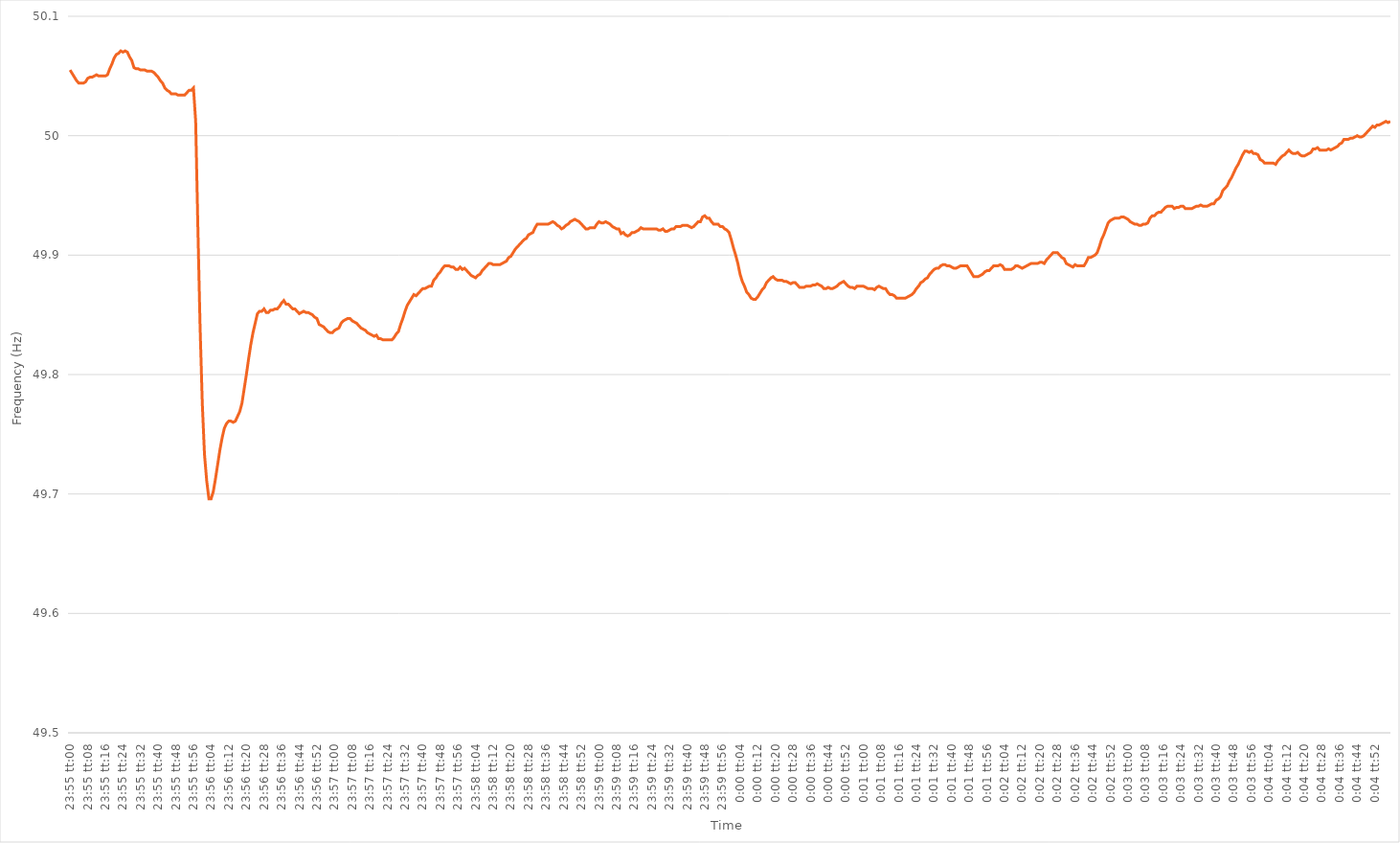
| Category | Series 0 |
|---|---|
| 0.9965277777777778 | 50.055 |
| 0.9965393518518518 | 50.052 |
| 0.9965509259259259 | 50.049 |
| 0.9965625 | 50.046 |
| 0.9965740740740742 | 50.044 |
| 0.9965856481481481 | 50.044 |
| 0.9965972222222222 | 50.044 |
| 0.9966087962962963 | 50.045 |
| 0.9966203703703704 | 50.048 |
| 0.9966319444444444 | 50.049 |
| 0.9966435185185185 | 50.049 |
| 0.9966550925925927 | 50.05 |
| 0.9966666666666667 | 50.051 |
| 0.9966782407407407 | 50.05 |
| 0.9966898148148148 | 50.05 |
| 0.9967013888888889 | 50.05 |
| 0.9967129629629629 | 50.05 |
| 0.996724537037037 | 50.051 |
| 0.9967361111111112 | 50.056 |
| 0.9967476851851852 | 50.06 |
| 0.9967592592592592 | 50.065 |
| 0.9967708333333333 | 50.068 |
| 0.9967824074074074 | 50.069 |
| 0.9967939814814816 | 50.071 |
| 0.9968055555555555 | 50.07 |
| 0.9968171296296297 | 50.071 |
| 0.9968287037037037 | 50.07 |
| 0.9968402777777778 | 50.066 |
| 0.9968518518518518 | 50.063 |
| 0.9968634259259259 | 50.057 |
| 0.9968750000000001 | 50.056 |
| 0.9968865740740741 | 50.056 |
| 0.9968981481481481 | 50.055 |
| 0.9969097222222222 | 50.055 |
| 0.9969212962962963 | 50.055 |
| 0.9969328703703703 | 50.054 |
| 0.9969444444444444 | 50.054 |
| 0.9969560185185186 | 50.054 |
| 0.9969675925925926 | 50.053 |
| 0.9969791666666666 | 50.051 |
| 0.9969907407407407 | 50.049 |
| 0.9970023148148148 | 50.046 |
| 0.997013888888889 | 50.044 |
| 0.9970254629629629 | 50.04 |
| 0.997037037037037 | 50.038 |
| 0.9970486111111111 | 50.037 |
| 0.9970601851851852 | 50.035 |
| 0.9970717592592592 | 50.035 |
| 0.9970833333333333 | 50.035 |
| 0.9970949074074075 | 50.034 |
| 0.9971064814814815 | 50.034 |
| 0.9971180555555555 | 50.034 |
| 0.9971296296296296 | 50.034 |
| 0.9971412037037037 | 50.036 |
| 0.9971527777777777 | 50.038 |
| 0.9971643518518518 | 50.038 |
| 0.997175925925926 | 50.04 |
| 0.9971875 | 50.012 |
| 0.997199074074074 | 49.923 |
| 0.9972106481481481 | 49.84 |
| 0.9972222222222222 | 49.776 |
| 0.9972337962962964 | 49.733 |
| 0.9972453703703703 | 49.711 |
| 0.9972569444444445 | 49.696 |
| 0.9972685185185185 | 49.696 |
| 0.9972800925925926 | 49.702 |
| 0.9972916666666666 | 49.713 |
| 0.9973032407407407 | 49.725 |
| 0.9973148148148149 | 49.737 |
| 0.9973263888888889 | 49.747 |
| 0.997337962962963 | 49.755 |
| 0.997349537037037 | 49.759 |
| 0.9973611111111111 | 49.761 |
| 0.9973726851851853 | 49.761 |
| 0.9973842592592592 | 49.76 |
| 0.9973958333333334 | 49.761 |
| 0.9974074074074074 | 49.765 |
| 0.9974189814814814 | 49.769 |
| 0.9974305555555555 | 49.776 |
| 0.9974421296296296 | 49.788 |
| 0.9974537037037038 | 49.8 |
| 0.9974652777777777 | 49.813 |
| 0.9974768518518519 | 49.825 |
| 0.9974884259259259 | 49.835 |
| 0.9975 | 49.843 |
| 0.997511574074074 | 49.851 |
| 0.9975231481481481 | 49.853 |
| 0.9975347222222223 | 49.853 |
| 0.9975462962962963 | 49.855 |
| 0.9975578703703704 | 49.852 |
| 0.9975694444444444 | 49.852 |
| 0.9975810185185185 | 49.854 |
| 0.9975925925925927 | 49.854 |
| 0.9976041666666666 | 49.855 |
| 0.9976157407407408 | 49.855 |
| 0.9976273148148148 | 49.857 |
| 0.997638888888889 | 49.86 |
| 0.9976504629629629 | 49.862 |
| 0.997662037037037 | 49.859 |
| 0.9976736111111112 | 49.859 |
| 0.9976851851851851 | 49.857 |
| 0.9976967592592593 | 49.855 |
| 0.9977083333333333 | 49.855 |
| 0.9977199074074075 | 49.853 |
| 0.9977314814814814 | 49.851 |
| 0.9977430555555555 | 49.852 |
| 0.9977546296296297 | 49.853 |
| 0.9977662037037037 | 49.852 |
| 0.9977777777777778 | 49.852 |
| 0.9977893518518518 | 49.851 |
| 0.997800925925926 | 49.85 |
| 0.9978125000000001 | 49.848 |
| 0.997824074074074 | 49.847 |
| 0.9978356481481482 | 49.842 |
| 0.9978472222222222 | 49.841 |
| 0.9978587962962964 | 49.84 |
| 0.9978703703703703 | 49.838 |
| 0.9978819444444444 | 49.836 |
| 0.9978935185185186 | 49.835 |
| 0.9979050925925925 | 49.835 |
| 0.9979166666666667 | 49.837 |
| 0.9979282407407407 | 49.838 |
| 0.9979398148148149 | 49.839 |
| 0.9979513888888888 | 49.843 |
| 0.9979629629629629 | 49.845 |
| 0.9979745370370371 | 49.846 |
| 0.9979861111111111 | 49.847 |
| 0.9979976851851852 | 49.847 |
| 0.9980092592592592 | 49.845 |
| 0.9980208333333334 | 49.844 |
| 0.9980324074074075 | 49.843 |
| 0.9980439814814814 | 49.841 |
| 0.9980555555555556 | 49.839 |
| 0.9980671296296296 | 49.838 |
| 0.9980787037037038 | 49.837 |
| 0.9980902777777777 | 49.835 |
| 0.9981018518518519 | 49.834 |
| 0.998113425925926 | 49.833 |
| 0.9981249999999999 | 49.832 |
| 0.9981365740740741 | 49.833 |
| 0.9981481481481481 | 49.83 |
| 0.9981597222222223 | 49.83 |
| 0.9981712962962962 | 49.829 |
| 0.9981828703703703 | 49.829 |
| 0.9981944444444445 | 49.829 |
| 0.9982060185185185 | 49.829 |
| 0.9982175925925926 | 49.829 |
| 0.9982291666666666 | 49.831 |
| 0.9982407407407408 | 49.834 |
| 0.9982523148148149 | 49.836 |
| 0.9982638888888888 | 49.842 |
| 0.998275462962963 | 49.847 |
| 0.998287037037037 | 49.853 |
| 0.9982986111111112 | 49.858 |
| 0.9983101851851851 | 49.861 |
| 0.9983217592592593 | 49.864 |
| 0.9983333333333334 | 49.867 |
| 0.9983449074074073 | 49.866 |
| 0.9983564814814815 | 49.868 |
| 0.9983680555555555 | 49.87 |
| 0.9983796296296297 | 49.872 |
| 0.9983912037037036 | 49.872 |
| 0.9984027777777778 | 49.873 |
| 0.9984143518518519 | 49.874 |
| 0.9984259259259259 | 49.874 |
| 0.9984375 | 49.879 |
| 0.998449074074074 | 49.881 |
| 0.9984606481481482 | 49.884 |
| 0.9984722222222223 | 49.886 |
| 0.9984837962962962 | 49.889 |
| 0.9984953703703704 | 49.891 |
| 0.9985069444444444 | 49.891 |
| 0.9985185185185186 | 49.891 |
| 0.9985300925925925 | 49.89 |
| 0.9985416666666667 | 49.89 |
| 0.9985532407407408 | 49.888 |
| 0.9985648148148147 | 49.888 |
| 0.9985763888888889 | 49.89 |
| 0.9985879629629629 | 49.888 |
| 0.9985995370370371 | 49.889 |
| 0.998611111111111 | 49.887 |
| 0.9986226851851852 | 49.885 |
| 0.9986342592592593 | 49.883 |
| 0.9986458333333333 | 49.882 |
| 0.9986574074074074 | 49.881 |
| 0.9986689814814814 | 49.883 |
| 0.9986805555555556 | 49.884 |
| 0.9986921296296297 | 49.887 |
| 0.9987037037037036 | 49.889 |
| 0.9987152777777778 | 49.891 |
| 0.9987268518518518 | 49.893 |
| 0.998738425925926 | 49.893 |
| 0.9987499999999999 | 49.892 |
| 0.9987615740740741 | 49.892 |
| 0.9987731481481482 | 49.892 |
| 0.9987847222222223 | 49.892 |
| 0.9987962962962963 | 49.893 |
| 0.9988078703703703 | 49.894 |
| 0.9988194444444445 | 49.895 |
| 0.9988310185185186 | 49.898 |
| 0.9988425925925926 | 49.899 |
| 0.9988541666666667 | 49.902 |
| 0.9988657407407407 | 49.905 |
| 0.9988773148148148 | 49.907 |
| 0.9988888888888888 | 49.909 |
| 0.998900462962963 | 49.911 |
| 0.9989120370370371 | 49.913 |
| 0.998923611111111 | 49.914 |
| 0.9989351851851852 | 49.917 |
| 0.9989467592592592 | 49.918 |
| 0.9989583333333334 | 49.919 |
| 0.9989699074074073 | 49.923 |
| 0.9989814814814815 | 49.926 |
| 0.9989930555555556 | 49.926 |
| 0.9990046296296297 | 49.926 |
| 0.9990162037037037 | 49.926 |
| 0.9990277777777777 | 49.926 |
| 0.9990393518518519 | 49.926 |
| 0.999050925925926 | 49.927 |
| 0.9990625 | 49.928 |
| 0.9990740740740741 | 49.927 |
| 0.9990856481481482 | 49.925 |
| 0.9990972222222222 | 49.924 |
| 0.9991087962962962 | 49.922 |
| 0.9991203703703704 | 49.923 |
| 0.9991319444444445 | 49.925 |
| 0.9991435185185185 | 49.926 |
| 0.9991550925925926 | 49.928 |
| 0.9991666666666666 | 49.929 |
| 0.9991782407407408 | 49.93 |
| 0.9991898148148147 | 49.929 |
| 0.9992013888888889 | 49.928 |
| 0.999212962962963 | 49.926 |
| 0.9992245370370371 | 49.924 |
| 0.9992361111111111 | 49.922 |
| 0.9992476851851851 | 49.922 |
| 0.9992592592592593 | 49.923 |
| 0.9992708333333334 | 49.923 |
| 0.9992824074074074 | 49.923 |
| 0.9992939814814815 | 49.926 |
| 0.9993055555555556 | 49.928 |
| 0.9993171296296296 | 49.927 |
| 0.9993287037037036 | 49.927 |
| 0.9993402777777778 | 49.928 |
| 0.9993518518518519 | 49.927 |
| 0.9993634259259259 | 49.926 |
| 0.999375 | 49.924 |
| 0.999386574074074 | 49.923 |
| 0.9993981481481482 | 49.922 |
| 0.9994097222222221 | 49.922 |
| 0.9994212962962963 | 49.918 |
| 0.9994328703703704 | 49.919 |
| 0.9994444444444445 | 49.917 |
| 0.9994560185185185 | 49.916 |
| 0.9994675925925925 | 49.917 |
| 0.9994791666666667 | 49.919 |
| 0.9994907407407408 | 49.919 |
| 0.9995023148148148 | 49.92 |
| 0.9995138888888889 | 49.921 |
| 0.999525462962963 | 49.923 |
| 0.999537037037037 | 49.922 |
| 0.999548611111111 | 49.922 |
| 0.9995601851851852 | 49.922 |
| 0.9995717592592593 | 49.922 |
| 0.9995833333333333 | 49.922 |
| 0.9995949074074074 | 49.922 |
| 0.9996064814814815 | 49.922 |
| 0.9996180555555556 | 49.921 |
| 0.9996296296296295 | 49.921 |
| 0.9996412037037037 | 49.922 |
| 0.9996527777777778 | 49.92 |
| 0.9996643518518519 | 49.92 |
| 0.9996759259259259 | 49.921 |
| 0.9996875 | 49.922 |
| 0.9996990740740741 | 49.922 |
| 0.9997106481481483 | 49.924 |
| 0.9997222222222222 | 49.924 |
| 0.9997337962962963 | 49.924 |
| 0.9997453703703704 | 49.925 |
| 0.9997569444444444 | 49.925 |
| 0.9997685185185184 | 49.925 |
| 0.9997800925925926 | 49.924 |
| 0.9997916666666667 | 49.923 |
| 0.9998032407407407 | 49.924 |
| 0.9998148148148148 | 49.926 |
| 0.9998263888888889 | 49.928 |
| 0.999837962962963 | 49.928 |
| 0.9998495370370369 | 49.932 |
| 0.9998611111111111 | 49.933 |
| 0.9998726851851852 | 49.931 |
| 0.9998842592592593 | 49.931 |
| 0.9998958333333333 | 49.928 |
| 0.9999074074074074 | 49.926 |
| 0.9999189814814815 | 49.926 |
| 0.9999305555555557 | 49.926 |
| 0.9999421296296296 | 49.924 |
| 0.9999537037037037 | 49.924 |
| 0.9999652777777778 | 49.922 |
| 0.9999768518518519 | 49.921 |
| 0.9999884259259259 | 49.919 |
| 0.0 | 49.913 |
| 1.1574074074074073e-05 | 49.906 |
| 2.3148148148148147e-05 | 49.9 |
| 3.472222222222222e-05 | 49.893 |
| 4.6296296296296294e-05 | 49.884 |
| 5.7870370370370366e-05 | 49.878 |
| 6.944444444444444e-05 | 49.874 |
| 8.101851851851852e-05 | 49.869 |
| 9.259259259259259e-05 | 49.867 |
| 0.00010416666666666667 | 49.864 |
| 0.00011574074074074073 | 49.863 |
| 0.0001273148148148148 | 49.863 |
| 0.0001388888888888889 | 49.865 |
| 0.00015046296296296297 | 49.868 |
| 0.00016203703703703703 | 49.871 |
| 0.00017361111111111112 | 49.873 |
| 0.00018518518518518518 | 49.877 |
| 0.00019675925925925926 | 49.879 |
| 0.00020833333333333335 | 49.881 |
| 0.0002199074074074074 | 49.882 |
| 0.00023148148148148146 | 49.88 |
| 0.00024305555555555552 | 49.879 |
| 0.0002546296296296296 | 49.879 |
| 0.0002662037037037037 | 49.879 |
| 0.0002777777777777778 | 49.878 |
| 0.0002893518518518519 | 49.878 |
| 0.00030092592592592595 | 49.877 |
| 0.0003125 | 49.876 |
| 0.00032407407407407406 | 49.877 |
| 0.0003356481481481481 | 49.877 |
| 0.00034722222222222224 | 49.875 |
| 0.00035879629629629635 | 49.873 |
| 0.00037037037037037035 | 49.873 |
| 0.00038194444444444446 | 49.873 |
| 0.0003935185185185185 | 49.874 |
| 0.0004050925925925926 | 49.874 |
| 0.0004166666666666667 | 49.874 |
| 0.00042824074074074075 | 49.875 |
| 0.0004398148148148148 | 49.875 |
| 0.0004513888888888889 | 49.876 |
| 0.0004629629629629629 | 49.875 |
| 0.00047453703703703704 | 49.874 |
| 0.00048611111111111104 | 49.872 |
| 0.0004976851851851852 | 49.872 |
| 0.0005092592592592592 | 49.873 |
| 0.0005208333333333333 | 49.872 |
| 0.0005324074074074074 | 49.872 |
| 0.0005439814814814814 | 49.873 |
| 0.0005555555555555556 | 49.874 |
| 0.0005671296296296296 | 49.876 |
| 0.0005787037037037038 | 49.877 |
| 0.0005902777777777778 | 49.878 |
| 0.0006018518518518519 | 49.876 |
| 0.0006134259259259259 | 49.874 |
| 0.000625 | 49.873 |
| 0.000636574074074074 | 49.873 |
| 0.0006481481481481481 | 49.872 |
| 0.0006597222222222221 | 49.874 |
| 0.0006712962962962962 | 49.874 |
| 0.0006828703703703703 | 49.874 |
| 0.0006944444444444445 | 49.874 |
| 0.0007060185185185185 | 49.873 |
| 0.0007175925925925927 | 49.872 |
| 0.0007291666666666667 | 49.872 |
| 0.0007407407407407407 | 49.872 |
| 0.0007523148148148147 | 49.871 |
| 0.0007638888888888889 | 49.873 |
| 0.000775462962962963 | 49.874 |
| 0.000787037037037037 | 49.873 |
| 0.000798611111111111 | 49.872 |
| 0.0008101851851851852 | 49.872 |
| 0.0008217592592592592 | 49.869 |
| 0.0008333333333333334 | 49.867 |
| 0.0008449074074074075 | 49.867 |
| 0.0008564814814814815 | 49.866 |
| 0.0008680555555555555 | 49.864 |
| 0.0008796296296296296 | 49.864 |
| 0.0008912037037037036 | 49.864 |
| 0.0009027777777777778 | 49.864 |
| 0.0009143518518518518 | 49.864 |
| 0.0009259259259259259 | 49.865 |
| 0.0009375000000000001 | 49.866 |
| 0.0009490740740740741 | 49.867 |
| 0.0009606481481481481 | 49.869 |
| 0.0009722222222222221 | 49.872 |
| 0.0009837962962962964 | 49.874 |
| 0.0009953703703703704 | 49.877 |
| 0.0010069444444444444 | 49.878 |
| 0.0010185185185185186 | 49.88 |
| 0.0010300925925925926 | 49.881 |
| 0.0010416666666666667 | 49.884 |
| 0.0010532407407407407 | 49.886 |
| 0.0010648148148148147 | 49.888 |
| 0.0010763888888888889 | 49.889 |
| 0.0010879629629629629 | 49.889 |
| 0.001099537037037037 | 49.891 |
| 0.0011111111111111111 | 49.892 |
| 0.0011226851851851851 | 49.892 |
| 0.0011342592592592591 | 49.891 |
| 0.0011458333333333333 | 49.891 |
| 0.0011574074074074073 | 49.89 |
| 0.0011689814814814816 | 49.889 |
| 0.0011805555555555556 | 49.889 |
| 0.0011921296296296296 | 49.89 |
| 0.0012037037037037038 | 49.891 |
| 0.0012152777777777778 | 49.891 |
| 0.0012268518518518518 | 49.891 |
| 0.0012384259259259258 | 49.891 |
| 0.00125 | 49.888 |
| 0.001261574074074074 | 49.885 |
| 0.0012731481481481483 | 49.882 |
| 0.0012847222222222223 | 49.882 |
| 0.0012962962962962963 | 49.882 |
| 0.0013078703703703705 | 49.883 |
| 0.0013194444444444443 | 49.884 |
| 0.0013310185185185185 | 49.886 |
| 0.0013425925925925925 | 49.887 |
| 0.0013541666666666667 | 49.887 |
| 0.001365740740740741 | 49.889 |
| 0.0013773148148148147 | 49.891 |
| 0.001388888888888889 | 49.891 |
| 0.001400462962962963 | 49.891 |
| 0.001412037037037037 | 49.892 |
| 0.001423611111111111 | 49.891 |
| 0.0014351851851851854 | 49.888 |
| 0.0014467592592592594 | 49.888 |
| 0.0014583333333333334 | 49.888 |
| 0.0014699074074074074 | 49.888 |
| 0.0014814814814814814 | 49.889 |
| 0.0014930555555555556 | 49.891 |
| 0.0015046296296296294 | 49.891 |
| 0.0015162037037037036 | 49.89 |
| 0.0015277777777777779 | 49.889 |
| 0.0015393518518518519 | 49.89 |
| 0.001550925925925926 | 49.891 |
| 0.0015624999999999999 | 49.892 |
| 0.001574074074074074 | 49.893 |
| 0.0015856481481481479 | 49.893 |
| 0.001597222222222222 | 49.893 |
| 0.0016087962962962963 | 49.893 |
| 0.0016203703703703703 | 49.894 |
| 0.0016319444444444445 | 49.894 |
| 0.0016435185185185183 | 49.893 |
| 0.0016550925925925926 | 49.896 |
| 0.0016666666666666668 | 49.898 |
| 0.0016782407407407406 | 49.9 |
| 0.001689814814814815 | 49.902 |
| 0.0017013888888888892 | 49.902 |
| 0.001712962962962963 | 49.902 |
| 0.0017245370370370372 | 49.9 |
| 0.001736111111111111 | 49.898 |
| 0.0017476851851851852 | 49.897 |
| 0.0017592592592592592 | 49.893 |
| 0.0017708333333333332 | 49.892 |
| 0.0017824074074074072 | 49.891 |
| 0.0017939814814814815 | 49.89 |
| 0.0018055555555555557 | 49.892 |
| 0.0018171296296296297 | 49.891 |
| 0.0018287037037037037 | 49.891 |
| 0.0018402777777777777 | 49.891 |
| 0.0018518518518518517 | 49.891 |
| 0.0018634259259259261 | 49.894 |
| 0.0018750000000000001 | 49.898 |
| 0.0018865740740740742 | 49.898 |
| 0.0018981481481481482 | 49.899 |
| 0.0019097222222222222 | 49.9 |
| 0.0019212962962962962 | 49.902 |
| 0.0019328703703703704 | 49.907 |
| 0.0019444444444444442 | 49.913 |
| 0.0019560185185185184 | 49.917 |
| 0.001967592592592593 | 49.922 |
| 0.001979166666666667 | 49.927 |
| 0.001990740740740741 | 49.929 |
| 0.002002314814814815 | 49.93 |
| 0.002013888888888889 | 49.931 |
| 0.002025462962962963 | 49.931 |
| 0.0020370370370370373 | 49.931 |
| 0.0020486111111111113 | 49.932 |
| 0.0020601851851851853 | 49.932 |
| 0.0020717592592592593 | 49.931 |
| 0.0020833333333333333 | 49.93 |
| 0.0020949074074074073 | 49.928 |
| 0.0021064814814814813 | 49.927 |
| 0.0021180555555555553 | 49.926 |
| 0.0021296296296296298 | 49.926 |
| 0.0021412037037037038 | 49.925 |
| 0.0021527777777777778 | 49.925 |
| 0.0021643518518518518 | 49.926 |
| 0.0021759259259259258 | 49.926 |
| 0.0021874999999999998 | 49.927 |
| 0.002199074074074074 | 49.931 |
| 0.0022106481481481478 | 49.933 |
| 0.0022222222222222222 | 49.933 |
| 0.0022337962962962967 | 49.935 |
| 0.0022453703703703702 | 49.936 |
| 0.0022569444444444447 | 49.936 |
| 0.0022685185185185182 | 49.938 |
| 0.0022800925925925927 | 49.94 |
| 0.0022916666666666667 | 49.941 |
| 0.0023032407407407407 | 49.941 |
| 0.002314814814814815 | 49.941 |
| 0.0023263888888888887 | 49.939 |
| 0.002337962962962963 | 49.94 |
| 0.002349537037037037 | 49.94 |
| 0.002361111111111111 | 49.941 |
| 0.002372685185185185 | 49.941 |
| 0.002384259259259259 | 49.939 |
| 0.0023958333333333336 | 49.939 |
| 0.0024074074074074076 | 49.939 |
| 0.0024189814814814816 | 49.939 |
| 0.0024305555555555556 | 49.94 |
| 0.0024421296296296296 | 49.941 |
| 0.0024537037037037036 | 49.941 |
| 0.0024652777777777776 | 49.942 |
| 0.0024768518518518516 | 49.941 |
| 0.002488425925925926 | 49.941 |
| 0.0025 | 49.941 |
| 0.002511574074074074 | 49.942 |
| 0.002523148148148148 | 49.943 |
| 0.002534722222222222 | 49.943 |
| 0.002546296296296296 | 49.946 |
| 0.0025578703703703705 | 49.947 |
| 0.0025694444444444445 | 49.949 |
| 0.0025810185185185185 | 49.954 |
| 0.0025925925925925925 | 49.956 |
| 0.0026041666666666665 | 49.958 |
| 0.002615740740740741 | 49.962 |
| 0.002627314814814815 | 49.965 |
| 0.0026388888888888885 | 49.969 |
| 0.0026504629629629625 | 49.973 |
| 0.0026620370370370374 | 49.976 |
| 0.002673611111111111 | 49.98 |
| 0.002685185185185185 | 49.984 |
| 0.0026967592592592594 | 49.987 |
| 0.0027083333333333334 | 49.987 |
| 0.0027199074074074074 | 49.986 |
| 0.002731481481481482 | 49.987 |
| 0.002743055555555556 | 49.985 |
| 0.0027546296296296294 | 49.985 |
| 0.0027662037037037034 | 49.984 |
| 0.002777777777777778 | 49.98 |
| 0.002789351851851852 | 49.979 |
| 0.002800925925925926 | 49.977 |
| 0.0028124999999999995 | 49.977 |
| 0.002824074074074074 | 49.977 |
| 0.002835648148148148 | 49.977 |
| 0.002847222222222222 | 49.977 |
| 0.0028587962962962963 | 49.976 |
| 0.002870370370370371 | 49.979 |
| 0.0028819444444444444 | 49.981 |
| 0.002893518518518519 | 49.983 |
| 0.002905092592592593 | 49.984 |
| 0.002916666666666667 | 49.986 |
| 0.0029282407407407412 | 49.988 |
| 0.002939814814814815 | 49.986 |
| 0.002951388888888889 | 49.985 |
| 0.002962962962962963 | 49.985 |
| 0.0029745370370370373 | 49.986 |
| 0.0029861111111111113 | 49.984 |
| 0.002997685185185185 | 49.983 |
| 0.003009259259259259 | 49.983 |
| 0.0030208333333333333 | 49.984 |
| 0.0030324074074074073 | 49.985 |
| 0.003043981481481482 | 49.986 |
| 0.0030555555555555557 | 49.989 |
| 0.0030671296296296297 | 49.989 |
| 0.0030787037037037037 | 49.99 |
| 0.003090277777777778 | 49.988 |
| 0.003101851851851852 | 49.988 |
| 0.0031134259259259257 | 49.988 |
| 0.0031249999999999997 | 49.988 |
| 0.003136574074074074 | 49.989 |
| 0.003148148148148148 | 49.988 |
| 0.003159722222222222 | 49.989 |
| 0.0031712962962962958 | 49.99 |
| 0.00318287037037037 | 49.991 |
| 0.003194444444444444 | 49.993 |
| 0.003206018518518519 | 49.994 |
| 0.0032175925925925926 | 49.997 |
| 0.0032291666666666666 | 49.997 |
| 0.0032407407407407406 | 49.997 |
| 0.003252314814814815 | 49.998 |
| 0.003263888888888889 | 49.998 |
| 0.003275462962962963 | 49.999 |
| 0.0032870370370370367 | 50 |
| 0.003298611111111111 | 49.999 |
| 0.003310185185185185 | 49.999 |
| 0.003321759259259259 | 50 |
| 0.0033333333333333335 | 50.002 |
| 0.003344907407407407 | 50.004 |
| 0.003356481481481481 | 50.006 |
| 0.003368055555555555 | 50.008 |
| 0.00337962962962963 | 50.007 |
| 0.0033912037037037036 | 50.009 |
| 0.0034027777777777784 | 50.009 |
| 0.003414351851851852 | 50.01 |
| 0.003425925925925926 | 50.011 |
| 0.0034375 | 50.012 |
| 0.0034490740740740745 | 50.011 |
| 0.0034606481481481485 | 50.012 |